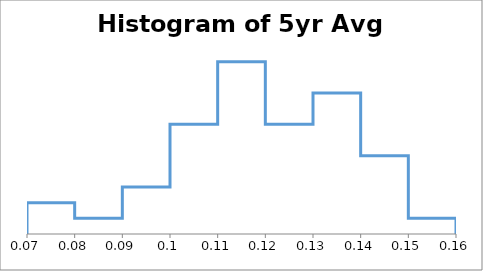
| Category | Series 0 |
|---|---|
| 0.07 | 0 |
| 0.07 | 2 |
| 0.08 | 2 |
| 0.08 | 1 |
| 0.09000000000000001 | 1 |
| 0.09000000000000001 | 3 |
| 0.1 | 3 |
| 0.1 | 7 |
| 0.11000000000000001 | 7 |
| 0.11000000000000001 | 11 |
| 0.12000000000000001 | 11 |
| 0.12000000000000001 | 7 |
| 0.13 | 7 |
| 0.13 | 9 |
| 0.14 | 9 |
| 0.14 | 5 |
| 0.15000000000000002 | 5 |
| 0.15000000000000002 | 1 |
| 0.16 | 1 |
| 0.16 | 0 |